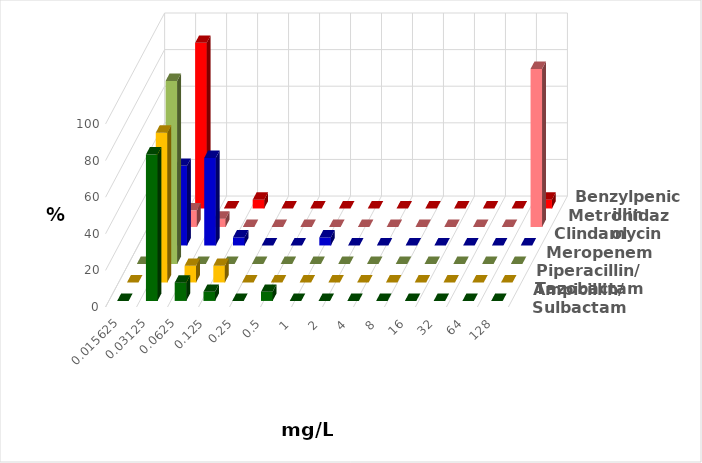
| Category | Ampicillin/ Sulbactam | Piperacillin/ Tazobactam | Meropenem | Clindamycin | Metronidazol | Benzylpenicillin |
|---|---|---|---|---|---|---|
| 0.015625 | 0 | 0 | 0 | 0 | 0 | 0 |
| 0.03125 | 80 | 81.818 | 100 | 43.478 | 9.091 | 90.476 |
| 0.0625 | 10 | 9.091 | 0 | 47.826 | 4.545 | 0 |
| 0.125 | 5 | 9.091 | 0 | 4.348 | 0 | 4.762 |
| 0.25 | 0 | 0 | 0 | 0 | 0 | 0 |
| 0.5 | 5 | 0 | 0 | 0 | 0 | 0 |
| 1.0 | 0 | 0 | 0 | 4.348 | 0 | 0 |
| 2.0 | 0 | 0 | 0 | 0 | 0 | 0 |
| 4.0 | 0 | 0 | 0 | 0 | 0 | 0 |
| 8.0 | 0 | 0 | 0 | 0 | 0 | 0 |
| 16.0 | 0 | 0 | 0 | 0 | 0 | 0 |
| 32.0 | 0 | 0 | 0 | 0 | 0 | 0 |
| 64.0 | 0 | 0 | 0 | 0 | 0 | 0 |
| 128.0 | 0 | 0 | 0 | 0 | 86.364 | 4.762 |